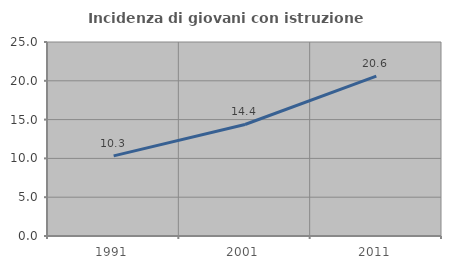
| Category | Incidenza di giovani con istruzione universitaria |
|---|---|
| 1991.0 | 10.324 |
| 2001.0 | 14.371 |
| 2011.0 | 20.6 |